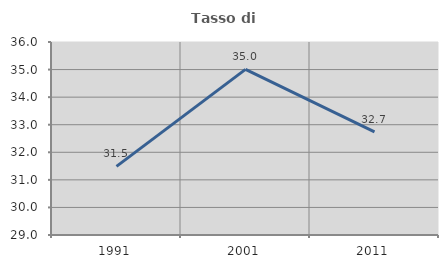
| Category | Tasso di occupazione   |
|---|---|
| 1991.0 | 31.488 |
| 2001.0 | 35.008 |
| 2011.0 | 32.742 |